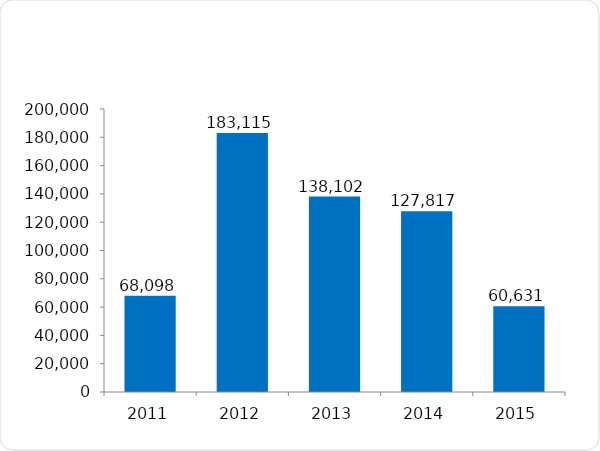
| Category | Personas Capacitadas |
|---|---|
| 2011 | 68098 |
| 2012 | 183115 |
| 2013 | 138102 |
| 2014 | 127817 |
| 2015 | 60631 |